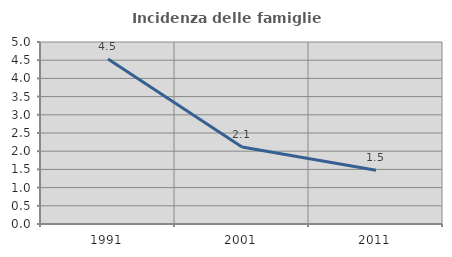
| Category | Incidenza delle famiglie numerose |
|---|---|
| 1991.0 | 4.536 |
| 2001.0 | 2.114 |
| 2011.0 | 1.477 |